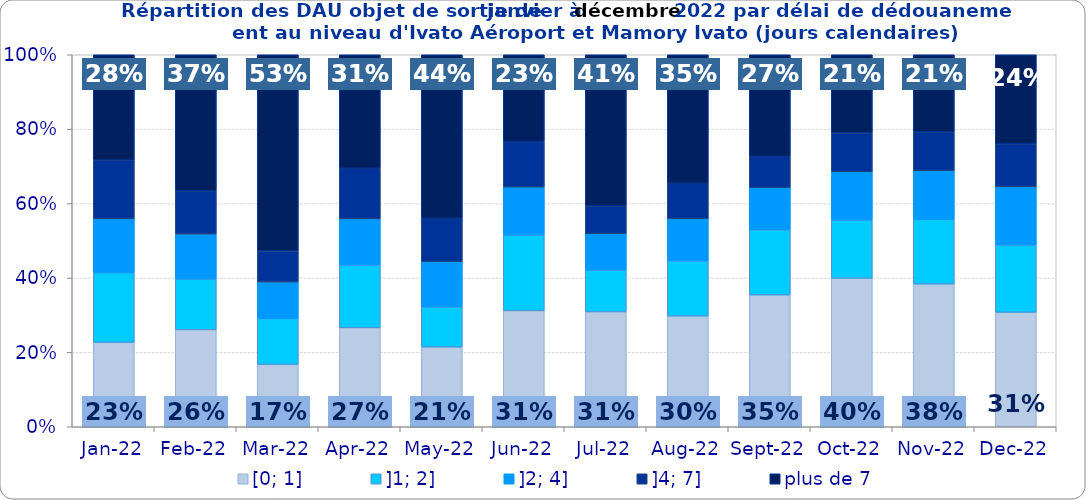
| Category | [0; 1] | ]1; 2] | ]2; 4] | ]4; 7] | plus de 7 |
|---|---|---|---|---|---|
| 2022-01-01 | 0.227 | 0.188 | 0.145 | 0.158 | 0.283 |
| 2022-02-01 | 0.261 | 0.136 | 0.121 | 0.116 | 0.366 |
| 2022-03-01 | 0.168 | 0.123 | 0.098 | 0.083 | 0.527 |
| 2022-04-01 | 0.266 | 0.169 | 0.124 | 0.136 | 0.305 |
| 2022-05-01 | 0.214 | 0.108 | 0.122 | 0.116 | 0.44 |
| 2022-06-01 | 0.312 | 0.203 | 0.129 | 0.122 | 0.233 |
| 2022-07-01 | 0.309 | 0.112 | 0.098 | 0.074 | 0.407 |
| 2022-08-01 | 0.298 | 0.148 | 0.114 | 0.095 | 0.345 |
| 2022-09-01 | 0.354 | 0.175 | 0.113 | 0.084 | 0.273 |
| 2022-10-01 | 0.399 | 0.156 | 0.13 | 0.105 | 0.21 |
| 2022-11-01 | 0.384 | 0.174 | 0.131 | 0.104 | 0.207 |
| 2022-12-01 | 0.308 | 0.181 | 0.156 | 0.116 | 0.239 |